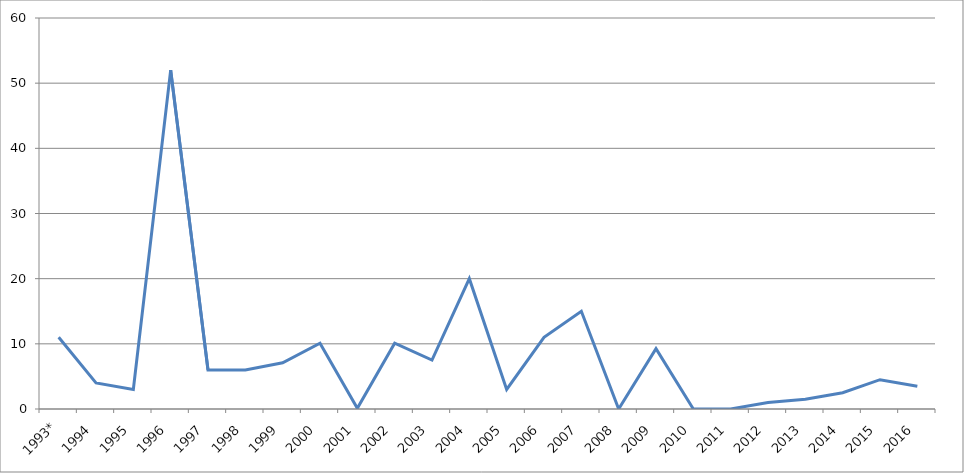
| Category | Series 0 |
|---|---|
| 1993* | 11 |
| 1994 | 4 |
| 1995 | 3 |
| 1996 | 52 |
| 1997 | 6 |
| 1998 | 6 |
| 1999 | 7.1 |
| 2000 | 10.1 |
| 2001 | 0.1 |
| 2002 | 10.1 |
| 2003 | 7.5 |
| 2004 | 20 |
| 2005 | 3 |
| 2006 | 11 |
| 2007 | 15 |
| 2008 | 0 |
| 2009 | 9.25 |
| 2010 | 0 |
| 2011 | 0 |
| 2012 | 1 |
| 2013 | 1.5 |
| 2014 | 2.5 |
| 2015 | 4.5 |
| 2016 | 3.5 |